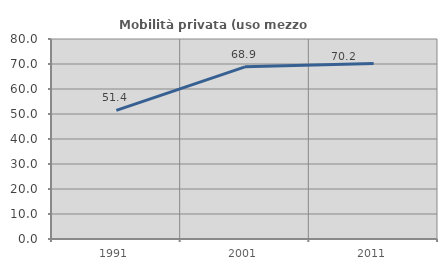
| Category | Mobilità privata (uso mezzo privato) |
|---|---|
| 1991.0 | 51.444 |
| 2001.0 | 68.876 |
| 2011.0 | 70.248 |